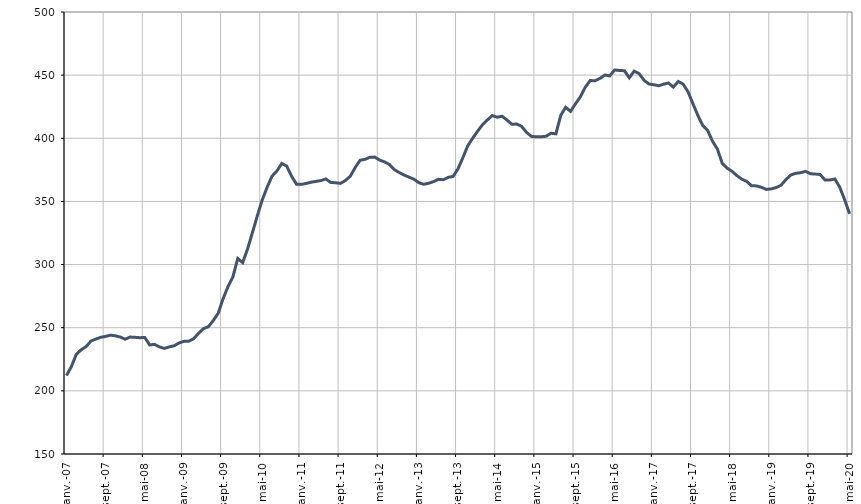
| Category | Catégorie E |
|---|---|
| 2007-01-01 | 212.1 |
| 2007-02-01 | 219.1 |
| 2007-03-01 | 228.8 |
| 2007-04-01 | 232.5 |
| 2007-05-01 | 235 |
| 2007-06-01 | 239.4 |
| 2007-07-01 | 241 |
| 2007-08-01 | 242.4 |
| 2007-09-01 | 243.1 |
| 2007-10-01 | 244.1 |
| 2007-11-01 | 243.6 |
| 2007-12-01 | 242.6 |
| 2008-01-01 | 240.9 |
| 2008-02-01 | 242.6 |
| 2008-03-01 | 242.4 |
| 2008-04-01 | 242.1 |
| 2008-05-01 | 242.3 |
| 2008-06-01 | 236.4 |
| 2008-07-01 | 236.8 |
| 2008-08-01 | 234.8 |
| 2008-09-01 | 233.6 |
| 2008-10-01 | 234.8 |
| 2008-11-01 | 235.7 |
| 2008-12-01 | 237.9 |
| 2009-01-01 | 239.2 |
| 2009-02-01 | 239.3 |
| 2009-03-01 | 241.3 |
| 2009-04-01 | 245.6 |
| 2009-05-01 | 249.3 |
| 2009-06-01 | 250.8 |
| 2009-07-01 | 255.7 |
| 2009-08-01 | 261.4 |
| 2009-09-01 | 273 |
| 2009-10-01 | 282.5 |
| 2009-11-01 | 290.1 |
| 2009-12-01 | 304.8 |
| 2010-01-01 | 301.5 |
| 2010-02-01 | 312.3 |
| 2010-03-01 | 325.3 |
| 2010-04-01 | 338.7 |
| 2010-05-01 | 351.1 |
| 2010-06-01 | 361.2 |
| 2010-07-01 | 370 |
| 2010-08-01 | 374.1 |
| 2010-09-01 | 380.1 |
| 2010-10-01 | 378 |
| 2010-11-01 | 370 |
| 2010-12-01 | 363.6 |
| 2011-01-01 | 363.5 |
| 2011-02-01 | 364.3 |
| 2011-03-01 | 365.2 |
| 2011-04-01 | 365.9 |
| 2011-05-01 | 366.5 |
| 2011-06-01 | 367.8 |
| 2011-07-01 | 365 |
| 2011-08-01 | 364.8 |
| 2011-09-01 | 364.3 |
| 2011-10-01 | 366.6 |
| 2011-11-01 | 370 |
| 2011-12-01 | 376.9 |
| 2012-01-01 | 382.6 |
| 2012-02-01 | 383.3 |
| 2012-03-01 | 385 |
| 2012-04-01 | 385.1 |
| 2012-05-01 | 382.7 |
| 2012-06-01 | 381.3 |
| 2012-07-01 | 379.2 |
| 2012-08-01 | 375.1 |
| 2012-09-01 | 372.9 |
| 2012-10-01 | 370.9 |
| 2012-11-01 | 369.2 |
| 2012-12-01 | 367.6 |
| 2013-01-01 | 364.8 |
| 2013-02-01 | 363.6 |
| 2013-03-01 | 364.4 |
| 2013-04-01 | 365.7 |
| 2013-05-01 | 367.5 |
| 2013-06-01 | 367.2 |
| 2013-07-01 | 369.1 |
| 2013-08-01 | 369.8 |
| 2013-09-01 | 375.8 |
| 2013-10-01 | 384.7 |
| 2013-11-01 | 394.1 |
| 2013-12-01 | 400 |
| 2014-01-01 | 405.6 |
| 2014-02-01 | 410.7 |
| 2014-03-01 | 414.5 |
| 2014-04-01 | 418 |
| 2014-05-01 | 416.7 |
| 2014-06-01 | 417.5 |
| 2014-07-01 | 414.5 |
| 2014-08-01 | 411.1 |
| 2014-09-01 | 411.3 |
| 2014-10-01 | 409.4 |
| 2014-11-01 | 404.7 |
| 2014-12-01 | 401.5 |
| 2015-01-01 | 401.2 |
| 2015-02-01 | 401.2 |
| 2015-03-01 | 401.6 |
| 2015-04-01 | 404 |
| 2015-05-01 | 403.5 |
| 2015-06-01 | 418.2 |
| 2015-07-01 | 424.6 |
| 2015-08-01 | 421.3 |
| 2015-09-01 | 427.3 |
| 2015-10-01 | 432.8 |
| 2015-11-01 | 440.4 |
| 2015-12-01 | 445.7 |
| 2016-01-01 | 445.6 |
| 2016-02-01 | 447.4 |
| 2016-03-01 | 450.1 |
| 2016-04-01 | 449.4 |
| 2016-05-01 | 454.1 |
| 2016-06-01 | 453.7 |
| 2016-07-01 | 453.5 |
| 2016-08-01 | 447.9 |
| 2016-09-01 | 453.2 |
| 2016-10-01 | 451.2 |
| 2016-11-01 | 446 |
| 2016-12-01 | 443 |
| 2017-01-01 | 442.4 |
| 2017-02-01 | 441.6 |
| 2017-03-01 | 442.8 |
| 2017-04-01 | 443.8 |
| 2017-05-01 | 440.5 |
| 2017-06-01 | 445 |
| 2017-07-01 | 442.9 |
| 2017-08-01 | 436.8 |
| 2017-09-01 | 427.4 |
| 2017-10-01 | 418.2 |
| 2017-11-01 | 410.2 |
| 2017-12-01 | 406.2 |
| 2018-01-01 | 397.7 |
| 2018-02-01 | 391.4 |
| 2018-03-01 | 380.1 |
| 2018-04-01 | 376.3 |
| 2018-05-01 | 373.8 |
| 2018-06-01 | 370.4 |
| 2018-07-01 | 367.6 |
| 2018-08-01 | 365.8 |
| 2018-09-01 | 362.4 |
| 2018-10-01 | 362.3 |
| 2018-11-01 | 361.2 |
| 2018-12-01 | 359.5 |
| 2019-01-01 | 359.9 |
| 2019-02-01 | 361 |
| 2019-03-01 | 362.8 |
| 2019-04-01 | 367.3 |
| 2019-05-01 | 370.9 |
| 2019-06-01 | 372.3 |
| 2019-07-01 | 372.7 |
| 2019-08-01 | 373.8 |
| 2019-09-01 | 371.9 |
| 2019-10-01 | 371.7 |
| 2019-11-01 | 371.3 |
| 2019-12-01 | 366.9 |
| 2020-01-01 | 367 |
| 2020-02-01 | 367.8 |
| 2020-03-01 | 361.3 |
| 2020-04-01 | 351.3 |
| 2020-05-01 | 340.2 |